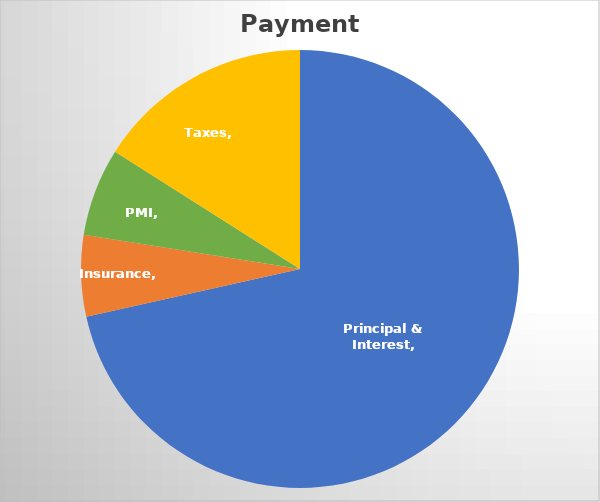
| Category | Series 0 |
|---|---|
| Principal & Interest | 1144 |
| Insurance | 96 |
| PMI | 104 |
| Taxes | 256 |